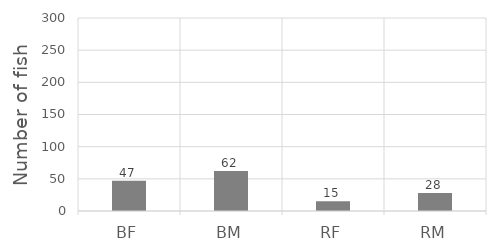
| Category | Series 0 |
|---|---|
| BF | 47 |
| BM | 62 |
| RF | 15 |
| RM | 28 |